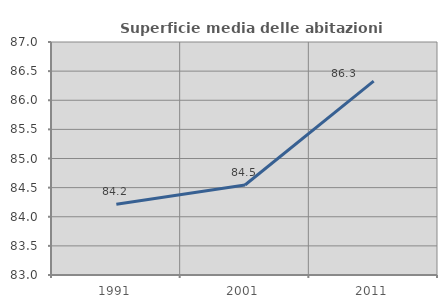
| Category | Superficie media delle abitazioni occupate |
|---|---|
| 1991.0 | 84.216 |
| 2001.0 | 84.545 |
| 2011.0 | 86.328 |